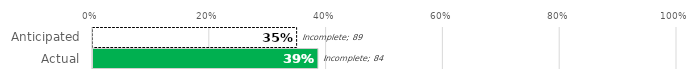
| Category | Complete | Incomplete |
|---|---|---|
| Anticipated | 48 | 89 |
| Actual | 53 | 84 |